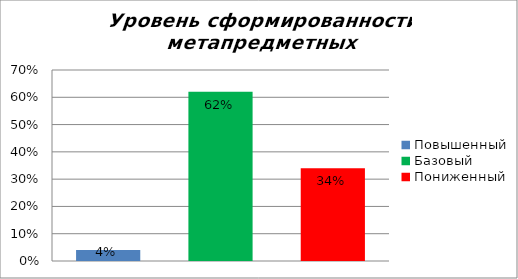
| Category | Уровень сформированности метапредметных результатов |
|---|---|
| Повышенный | 0.04 |
| Базовый | 0.62 |
| Пониженный | 0.34 |